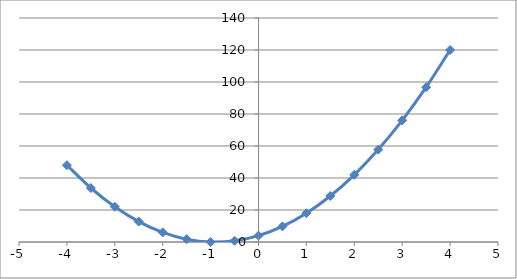
| Category | P(x) |
|---|---|
| -4.0 | 48 |
| -3.5 | 33.75 |
| -3.0 | 22 |
| -2.5 | 12.75 |
| -2.0 | 6 |
| -1.5 | 1.75 |
| -1.0 | 0 |
| -0.5 | 0.75 |
| 0.0 | 4 |
| 0.5 | 9.75 |
| 1.0 | 18 |
| 1.5 | 28.75 |
| 2.0 | 42 |
| 2.5 | 57.75 |
| 3.0 | 76 |
| 3.5 | 96.75 |
| 4.0 | 120 |